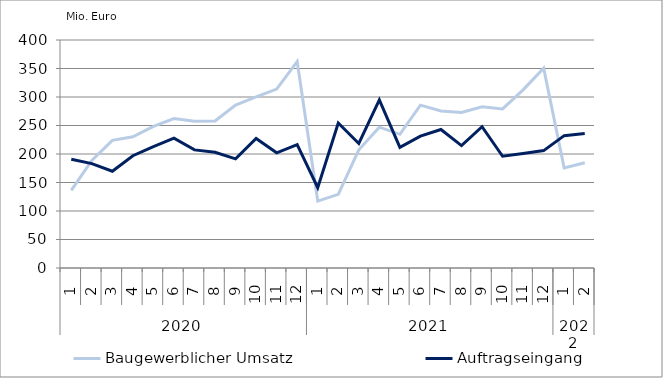
| Category | Baugewerblicher Umsatz | Auftragseingang |
|---|---|---|
| 0 | 136135.432 | 190647.086 |
| 1 | 188682.361 | 183141.14 |
| 2 | 224009.315 | 169770.009 |
| 3 | 230172.252 | 196979.845 |
| 4 | 248410.714 | 212955.83 |
| 5 | 262078.128 | 227853.487 |
| 6 | 257360.37 | 207209.188 |
| 7 | 257932.168 | 202976.091 |
| 8 | 285866.269 | 191463.844 |
| 9 | 300164.57 | 227245.467 |
| 10 | 313922.518 | 202060.636 |
| 11 | 362040.738 | 216296.504 |
| 12 | 117421.805 | 141020.655 |
| 13 | 129162.55 | 254416.876 |
| 14 | 207280.837 | 218451.405 |
| 15 | 247094.279 | 295077.868 |
| 16 | 234515.312 | 211696.129 |
| 17 | 285732.845 | 231455.155 |
| 18 | 275480.885 | 242932.505 |
| 19 | 272787.524 | 214636.944 |
| 20 | 282850.254 | 247827.991 |
| 21 | 279173.21 | 196069.238 |
| 22 | 312511.437 | 201015.897 |
| 23 | 350582.01 | 205949.991 |
| 24 | 175456.852 | 232178.255 |
| 25 | 184578.32 | 236006.862 |